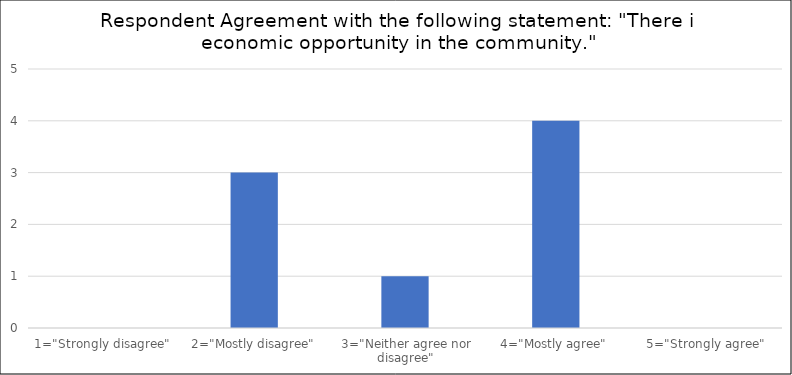
| Category | Number of Responses |
|---|---|
| 1="Strongly disagree" | 0 |
| 2="Mostly disagree" | 3 |
| 3="Neither agree nor disagree" | 1 |
| 4="Mostly agree" | 4 |
| 5="Strongly agree" | 0 |